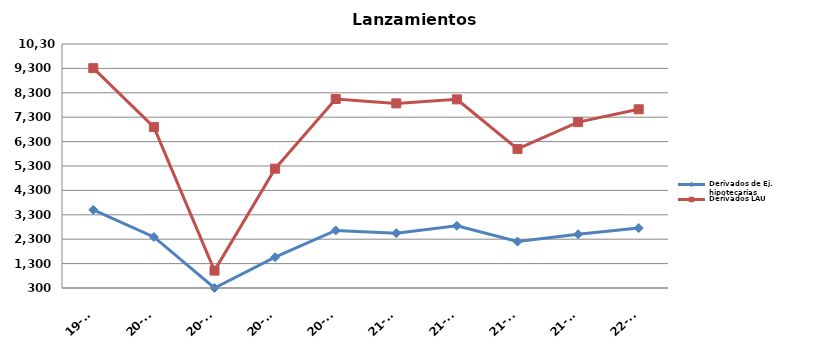
| Category | Derivados de Ej. hipotecarias | Derivados LAU |
|---|---|---|
| 19-T4 | 3503 | 9310 |
| 20-T1 | 2392 | 6896 |
| 20-T2 | 300 | 1013 |
| 20-T3 | 1564 | 5190 |
| 20-T4 | 2659 | 8046 |
| 21-T1 | 2548 | 7866 |
| 21-T2 | 2849 | 8031 |
| 21-T3 | 2203 | 5999 |
| 21-T4 | 2503 | 7097 |
| 22-T1 | 2755 | 7625 |